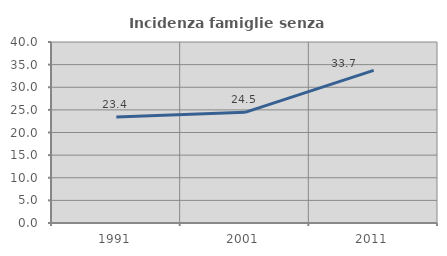
| Category | Incidenza famiglie senza nuclei |
|---|---|
| 1991.0 | 23.398 |
| 2001.0 | 24.463 |
| 2011.0 | 33.726 |